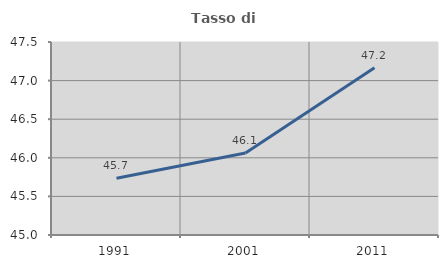
| Category | Tasso di occupazione   |
|---|---|
| 1991.0 | 45.736 |
| 2001.0 | 46.061 |
| 2011.0 | 47.168 |